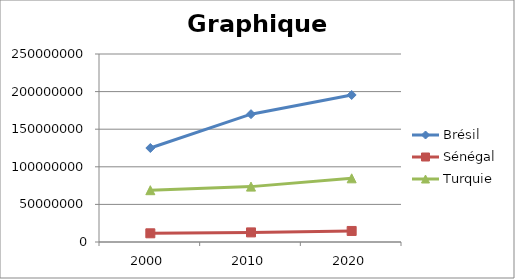
| Category | Brésil | Sénégal | Turquie |
|---|---|---|---|
| 2000.0 | 125000000 | 11555000 | 68888822 |
| 2010.0 | 170000000 | 12768000 | 73639596 |
| 2020.0 | 195500000 | 14683200 | 84685535.4 |